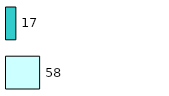
| Category | Series 0 | Series 1 |
|---|---|---|
| 0 | 58 | 17 |